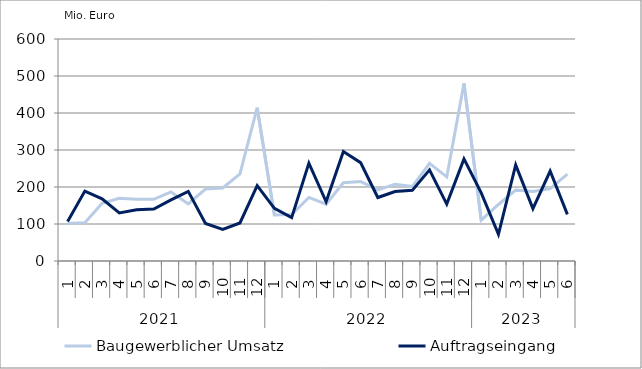
| Category | Baugewerblicher Umsatz | Auftragseingang |
|---|---|---|
| 0 | 101295.895 | 106850.127 |
| 1 | 103236.543 | 188883.434 |
| 2 | 156172.725 | 168204.42 |
| 3 | 169257.088 | 130052.073 |
| 4 | 166897.821 | 138492.214 |
| 5 | 166720.216 | 140262.426 |
| 6 | 186515.191 | 165331.191 |
| 7 | 154188.941 | 188169.655 |
| 8 | 194464.12 | 101359.538 |
| 9 | 197281.201 | 85626.862 |
| 10 | 235325.083 | 102880.924 |
| 11 | 414469.471 | 203900.676 |
| 12 | 124217.549 | 142351.759 |
| 13 | 125619.696 | 117194.423 |
| 14 | 171896.664 | 264509.013 |
| 15 | 153384.654 | 160146.519 |
| 16 | 211335.38 | 295997.826 |
| 17 | 214914.164 | 265813.917 |
| 18 | 192047.613 | 171529.517 |
| 19 | 207577.681 | 187809.656 |
| 20 | 201109.781 | 190941.096 |
| 21 | 264135.048 | 246250.021 |
| 22 | 227299.047 | 153783.993 |
| 23 | 480026.589 | 276019.328 |
| 24 | 110408.991 | 184068.731 |
| 25 | 152702.87 | 72330.186 |
| 26 | 191677.032 | 259741.102 |
| 27 | 187876.702 | 141464.389 |
| 28 | 195815.34 | 243069.898 |
| 29 | 234759.067 | 125882.939 |